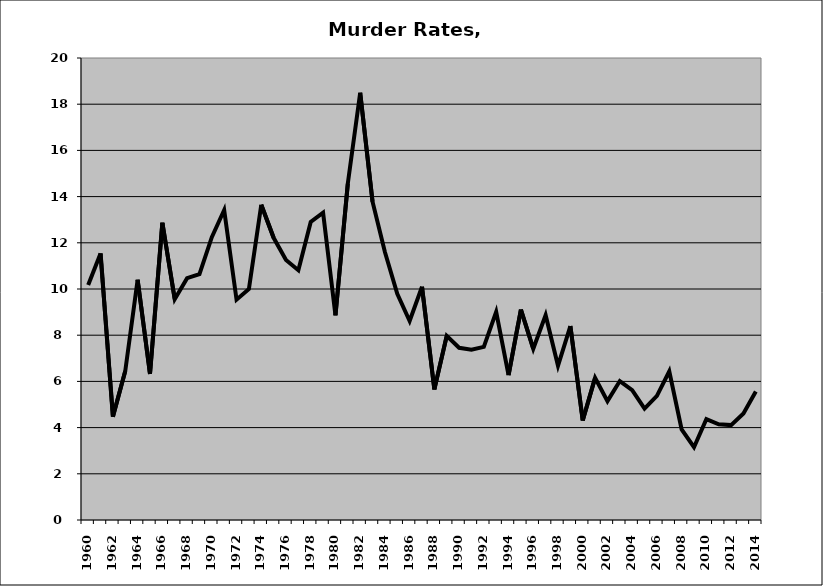
| Category | Murder |
|---|---|
| 1960.0 | 10.169 |
| 1961.0 | 11.538 |
| 1962.0 | 4.472 |
| 1963.0 | 6.452 |
| 1964.0 | 10.4 |
| 1965.0 | 6.324 |
| 1966.0 | 12.868 |
| 1967.0 | 9.559 |
| 1968.0 | 10.469 |
| 1969.0 | 10.638 |
| 1970.0 | 12.245 |
| 1971.0 | 13.419 |
| 1972.0 | 9.538 |
| 1973.0 | 10 |
| 1974.0 | 13.65 |
| 1975.0 | 12.216 |
| 1976.0 | 11.257 |
| 1977.0 | 10.811 |
| 1978.0 | 12.903 |
| 1979.0 | 13.3 |
| 1980.0 | 8.861 |
| 1981.0 | 14.563 |
| 1982.0 | 18.493 |
| 1983.0 | 13.779 |
| 1984.0 | 11.6 |
| 1985.0 | 9.789 |
| 1986.0 | 8.614 |
| 1987.0 | 10.095 |
| 1988.0 | 5.653 |
| 1989.0 | 7.97 |
| 1990.0 | 7.454 |
| 1991.0 | 7.368 |
| 1992.0 | 7.496 |
| 1993.0 | 9.015 |
| 1994.0 | 6.271 |
| 1995.0 | 9.106 |
| 1996.0 | 7.414 |
| 1997.0 | 8.867 |
| 1998.0 | 6.678 |
| 1999.0 | 8.394 |
| 2000.0 | 4.307 |
| 2001.0 | 6.155 |
| 2002.0 | 5.144 |
| 2003.0 | 6.016 |
| 2004.0 | 5.625 |
| 2005.0 | 4.825 |
| 2006.0 | 5.373 |
| 2007.0 | 6.438 |
| 2008.0 | 3.924 |
| 2009.0 | 3.15 |
| 2010.0 | 4.365 |
| 2011.0 | 4.144 |
| 2012.0 | 4.108 |
| 2013.0 | 4.612 |
| 2014.0 | 5.565 |